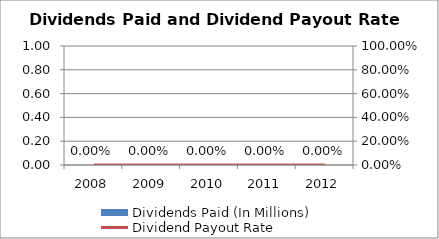
| Category | Dividends Paid (In Millions) |
|---|---|
| 2008.0 | 0 |
| 2009.0 | 0 |
| 2010.0 | 0 |
| 2011.0 | 0 |
| 2012.0 | 0 |